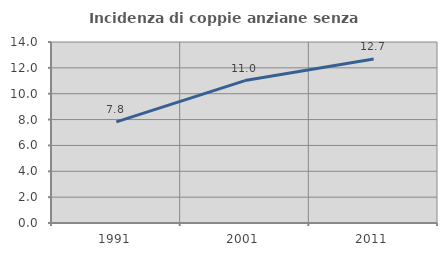
| Category | Incidenza di coppie anziane senza figli  |
|---|---|
| 1991.0 | 7.818 |
| 2001.0 | 11.015 |
| 2011.0 | 12.68 |